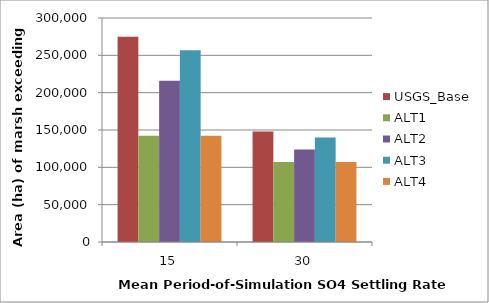
| Category | USGS_Base | ALT1 | ALT2 | ALT3 | ALT4 |
|---|---|---|---|---|---|
| 15.0 | 274875 | 142425 | 216025 | 256850 | 142425 |
| 30.0 | 147975 | 107000 | 123800 | 139950 | 107000 |